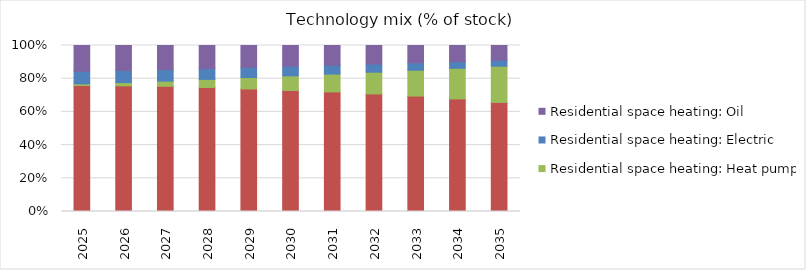
| Category | Residential space heating: Gas | Residential space heating: Heat pump | Residential space heating: Electric | Residential space heating: Oil |
|---|---|---|---|---|
| 2025.0 | 0.759 | 0.009 | 0.076 | 0.155 |
| 2026.0 | 0.757 | 0.02 | 0.073 | 0.15 |
| 2027.0 | 0.754 | 0.031 | 0.07 | 0.144 |
| 2028.0 | 0.747 | 0.049 | 0.066 | 0.138 |
| 2029.0 | 0.738 | 0.069 | 0.062 | 0.131 |
| 2030.0 | 0.729 | 0.088 | 0.058 | 0.125 |
| 2031.0 | 0.721 | 0.107 | 0.054 | 0.119 |
| 2032.0 | 0.708 | 0.131 | 0.049 | 0.112 |
| 2033.0 | 0.695 | 0.155 | 0.045 | 0.104 |
| 2034.0 | 0.678 | 0.184 | 0.04 | 0.097 |
| 2035.0 | 0.657 | 0.218 | 0.036 | 0.089 |